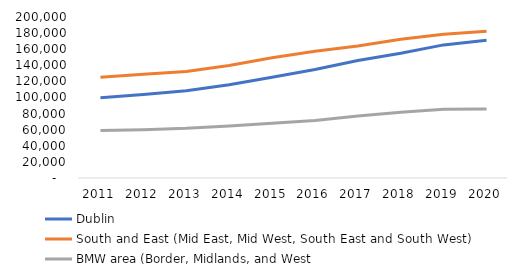
| Category | Dublin | South and East (Mid East, Mid West, South East and South West) | BMW area (Border, Midlands, and West |
|---|---|---|---|
| 2011.0 | 99587 | 125200 | 59057 |
| 2012.0 | 103590 | 128767 | 59950 |
| 2013.0 | 108273 | 132392 | 61674 |
| 2014.0 | 115755 | 139804 | 64594 |
| 2015.0 | 125166 | 149447 | 67882 |
| 2016.0 | 134722 | 157480 | 71530 |
| 2017.0 | 145840 | 163858 | 77003 |
| 2018.0 | 154984 | 172222 | 81782 |
| 2019.0 | 165348 | 178482 | 85469 |
| 2020.0 | 171206 | 182444 | 85732 |